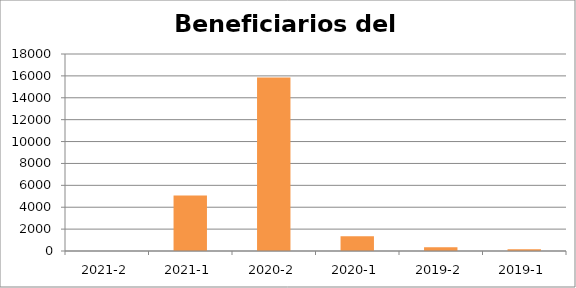
| Category | Beneficiarios del Periodo |
|---|---|
| 2021-2 | 0 |
| 2021-1 | 5078 |
| 2020-2 | 15859 |
| 2020-1 | 1350 |
| 2019-2 | 342 |
| 2019-1 | 165 |